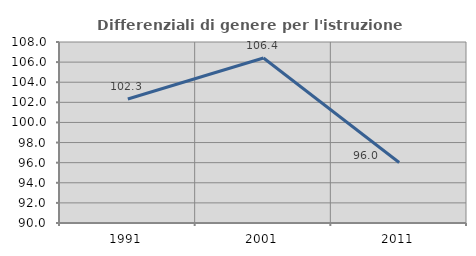
| Category | Differenziali di genere per l'istruzione superiore |
|---|---|
| 1991.0 | 102.327 |
| 2001.0 | 106.409 |
| 2011.0 | 96.015 |